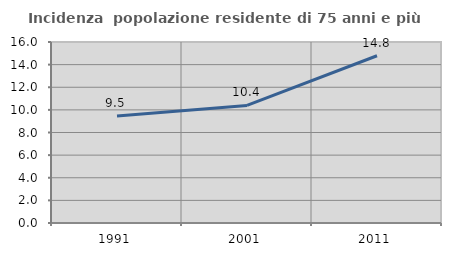
| Category | Incidenza  popolazione residente di 75 anni e più |
|---|---|
| 1991.0 | 9.457 |
| 2001.0 | 10.394 |
| 2011.0 | 14.783 |